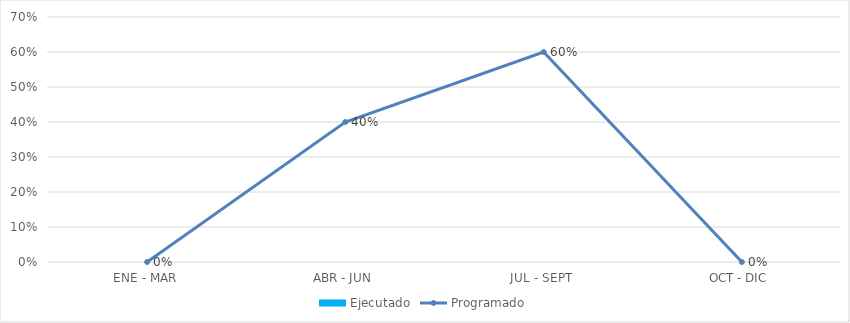
| Category | Ejecutado |
|---|---|
| ENE - MAR | 0 |
| ABR - JUN | 0 |
| JUL - SEPT | 0 |
| OCT - DIC | 0 |